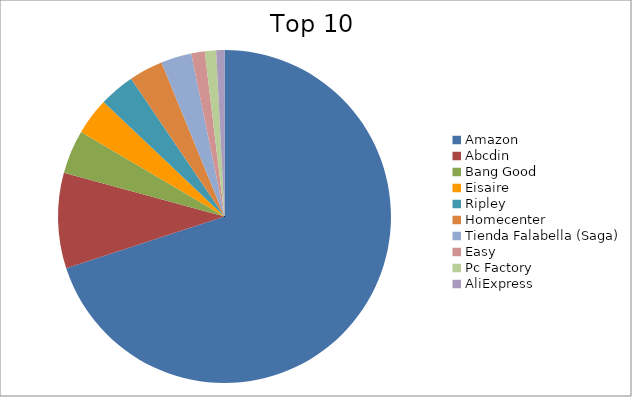
| Category | Series 0 |
|---|---|
| Amazon | 69.97 |
| Abcdin | 9.27 |
| Bang Good | 4.24 |
| Eisaire | 3.58 |
| Ripley | 3.46 |
| Homecenter | 3.3 |
| Tienda Falabella (Saga) | 2.97 |
| Easy | 1.31 |
| Pc Factory | 1.1 |
| AliExpress | 0.8 |